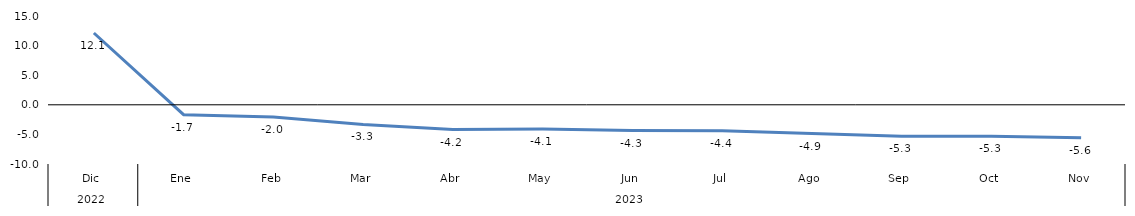
| Category | Bogotá |
|---|---|
| 0 | 12.128 |
| 1 | -1.667 |
| 2 | -2.043 |
| 3 | -3.32 |
| 4 | -4.182 |
| 5 | -4.103 |
| 6 | -4.343 |
| 7 | -4.385 |
| 8 | -4.853 |
| 9 | -5.292 |
| 10 | -5.294 |
| 11 | -5.569 |